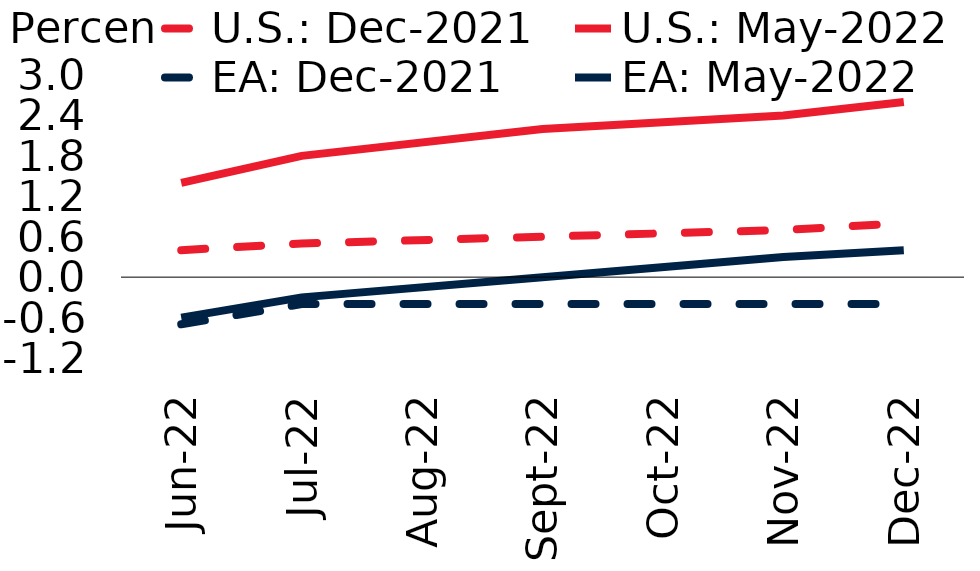
| Category | U.S.: Dec-2021 | U.S.: May-2022 | EA: Dec-2021 | EA: May-2022 |
|---|---|---|---|---|
| 2022-06-01 | 0.4 | 1.4 | -0.7 | -0.6 |
| 2022-07-01 | 0.5 | 1.8 | -0.4 | -0.3 |
| 2022-09-01 | 0.6 | 2.2 | -0.4 | 0 |
| 2022-11-01 | 0.7 | 2.4 | -0.4 | 0.3 |
| 2022-12-01 | 0.8 | 2.6 | -0.4 | 0.4 |